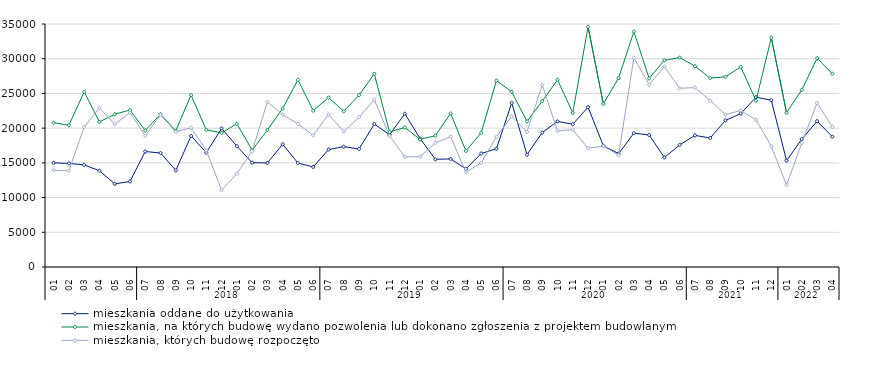
| Category | mieszkania oddane do użytkowania | mieszkania, na których budowę wydano pozwolenia lub dokonano zgłoszenia z projektem budowlanym | mieszkania, których budowę rozpoczęto |
|---|---|---|---|
| 0 | 15005 | 20783 | 13949 |
| 1 | 14921 | 20410 | 13851 |
| 2 | 14708 | 25239 | 20178 |
| 3 | 13861 | 20895 | 22924 |
| 4 | 11972 | 22003 | 20536 |
| 5 | 12319 | 22608 | 22228 |
| 6 | 16637 | 19658 | 18900 |
| 7 | 16415 | 22017 | 21929 |
| 8 | 13914 | 19613 | 19466 |
| 9 | 18871 | 24773 | 20063 |
| 10 | 16470 | 19748 | 16792 |
| 11 | 19970 | 19325 | 11091 |
| 12 | 17405 | 20630 | 13444 |
| 13 | 15021 | 16849 | 16682 |
| 14 | 14991 | 19732 | 23752 |
| 15 | 17673 | 22828 | 21958 |
| 16 | 14974 | 26965 | 20600 |
| 17 | 14412 | 22514 | 18956 |
| 18 | 16908 | 24407 | 21958 |
| 19 | 17334 | 22431 | 19528 |
| 20 | 16998 | 24754 | 21566 |
| 21 | 20592 | 27824 | 24095 |
| 22 | 19042 | 19448 | 18884 |
| 23 | 22075 | 20101 | 15858 |
| 24 | 18501 | 18370 | 15891 |
| 25 | 15507 | 18920 | 17875 |
| 26 | 15569 | 22122 | 18777 |
| 27 | 14116 | 16714 | 13647 |
| 28 | 16343 | 19338 | 15012 |
| 29 | 17036 | 26845 | 18763 |
| 30 | 23648 | 25237 | 21690 |
| 31 | 16183 | 20975 | 19460 |
| 32 | 19369 | 23885 | 26232 |
| 33 | 20973 | 26960 | 19601 |
| 34 | 20560 | 22183 | 19785 |
| 35 | 23026 | 34605 | 17109 |
| 36 | 17462 | 23485 | 17419 |
| 37 | 16322 | 27222 | 16116 |
| 38 | 19282 | 33901 | 30143 |
| 39 | 19019 | 27163 | 26261 |
| 40 | 15772 | 29768 | 28878 |
| 41 | 17587 | 30170 | 25744 |
| 42 | 18952 | 28922 | 25837 |
| 43 | 18583 | 27204 | 23971 |
| 44 | 21117 | 27397 | 21959 |
| 45 | 22097 | 28821 | 22533 |
| 46 | 24463 | 23947 | 21200 |
| 47 | 24024 | 33041 | 17364 |
| 48 | 15315 | 22221 | 11800 |
| 49 | 18420 | 25522 | 17855 |
| 50 | 21007 | 30065 | 23632 |
| 51 | 18764 | 27836 | 20173 |